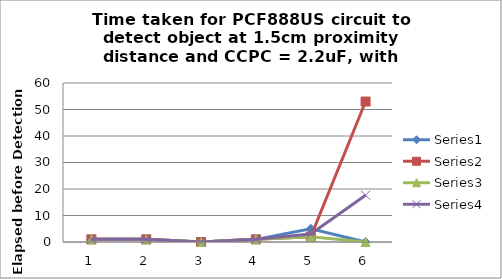
| Category | Series 0 | Series 1 | Series 2 | Series 3 |
|---|---|---|---|---|
| 0 | 1 | 1 | 1 | 1 |
| 1 | 1 | 1 | 1 | 1 |
| 2 | 0 | 0 | 0 | 0 |
| 3 | 1 | 1 | 1 | 1 |
| 4 | 5 | 2 | 2 | 3 |
| 5 | 0 | 53 | 0 | 17.667 |